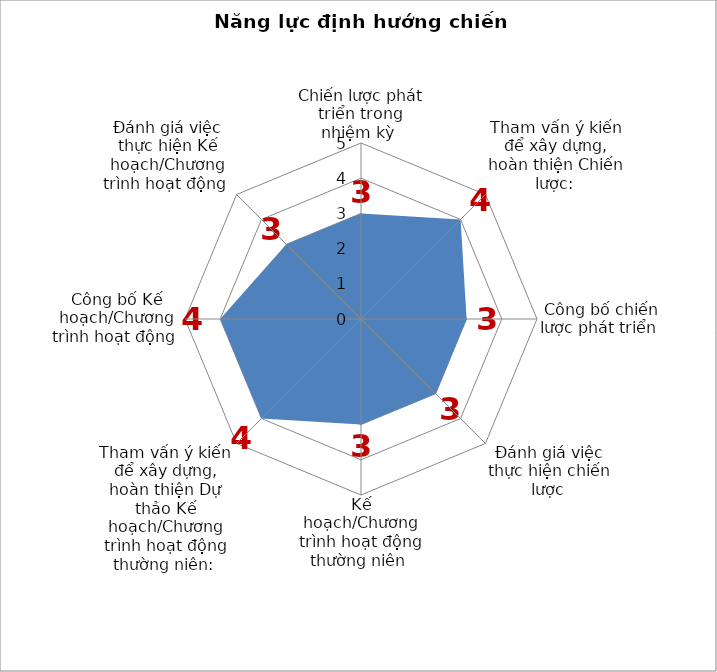
| Category | Series 0 |
|---|---|
| Chiến lược phát triển trong nhiệm kỳ  | 3 |
| Tham vấn ý kiến để xây dựng, hoàn thiện Chiến lược:  | 4 |
| Công bố chiến lược phát triển  | 3 |
| Đánh giá việc thực hiện chiến lược  | 3 |
| Kế hoạch/Chương trình hoạt động thường niên  | 3 |
| Tham vấn ý kiến để xây dựng, hoàn thiện Dự thảo Kế hoạch/Chương trình hoạt động thường niên:  | 4 |
| Công bố Kế hoạch/Chương trình hoạt động  | 4 |
| Đánh giá việc thực hiện Kế hoạch/Chương trình hoạt động  | 3 |